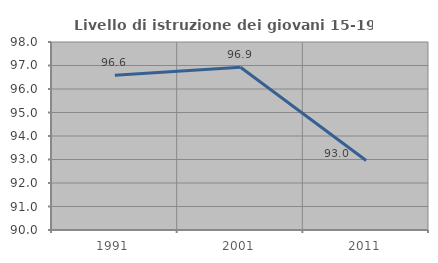
| Category | Livello di istruzione dei giovani 15-19 anni |
|---|---|
| 1991.0 | 96.581 |
| 2001.0 | 96.923 |
| 2011.0 | 92.958 |